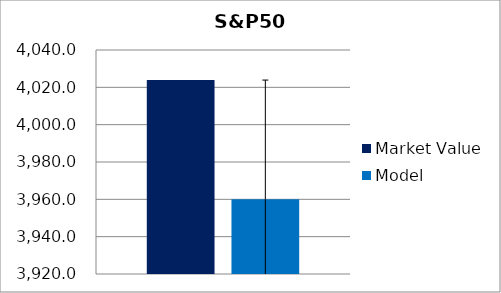
| Category | Market Value | Model |
|---|---|---|
| 0 | 4023.89 | 3960.051 |